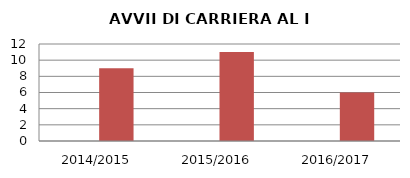
| Category | ANNO | NUMERO |
|---|---|---|
| 2014/2015 | 0 | 9 |
| 2015/2016 | 0 | 11 |
| 2016/2017 | 0 | 6 |